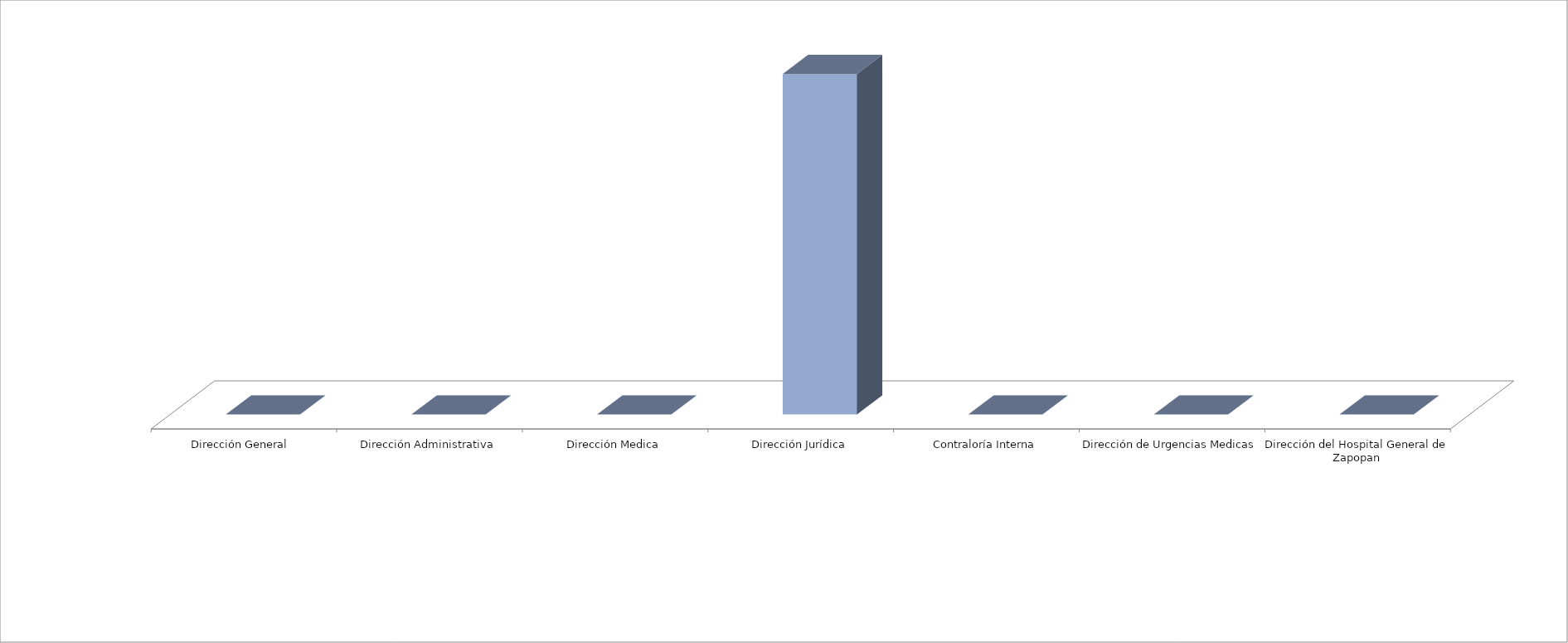
| Category | Series 0 | Series 1 |
|---|---|---|
| Dirección General  |  | 0 |
| Dirección Administrativa |  | 0 |
| Dirección Medica |  | 0 |
| Dirección Jurídica |  | 72 |
| Contraloría Interna |  | 0 |
| Dirección de Urgencias Medicas |  | 0 |
| Dirección del Hospital General de Zapopan |  | 0 |